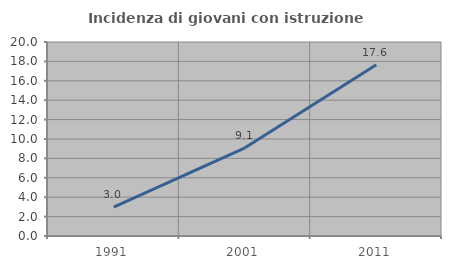
| Category | Incidenza di giovani con istruzione universitaria |
|---|---|
| 1991.0 | 2.985 |
| 2001.0 | 9.091 |
| 2011.0 | 17.647 |